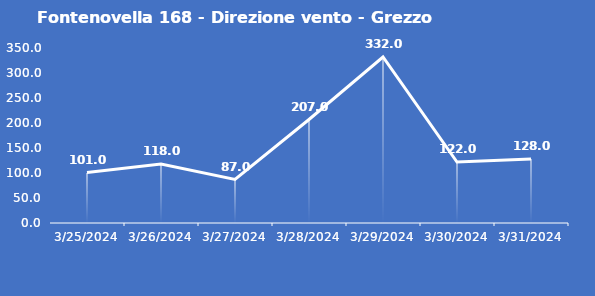
| Category | Fontenovella 168 - Direzione vento - Grezzo (°N) |
|---|---|
| 3/25/24 | 101 |
| 3/26/24 | 118 |
| 3/27/24 | 87 |
| 3/28/24 | 207 |
| 3/29/24 | 332 |
| 3/30/24 | 122 |
| 3/31/24 | 128 |